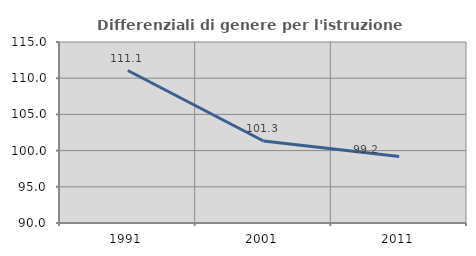
| Category | Differenziali di genere per l'istruzione superiore |
|---|---|
| 1991.0 | 111.062 |
| 2001.0 | 101.32 |
| 2011.0 | 99.2 |